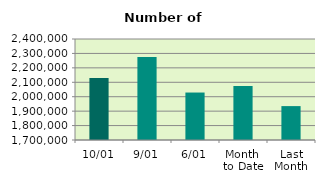
| Category | Series 0 |
|---|---|
| 10/01 | 2129860 |
| 9/01 | 2275516 |
| 6/01 | 2028996 |
| Month 
to Date | 2073803.714 |
| Last
Month | 1934937.048 |